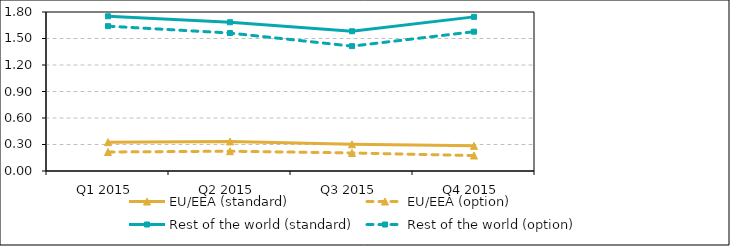
| Category | EU/EEA (standard) | EU/EEA (option) | Rest of the world (standard) | Rest of the world (option) |
|---|---|---|---|---|
| Q1 2015 | 0.326 | 0.215 | 1.752 | 1.64 |
| Q2 2015 | 0.335 | 0.224 | 1.684 | 1.562 |
| Q3 2015 | 0.303 | 0.204 | 1.582 | 1.413 |
| Q4 2015 | 0.284 | 0.175 | 1.745 | 1.577 |